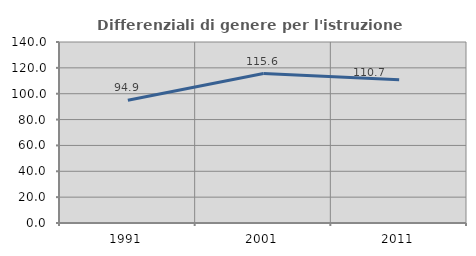
| Category | Differenziali di genere per l'istruzione superiore |
|---|---|
| 1991.0 | 94.918 |
| 2001.0 | 115.572 |
| 2011.0 | 110.709 |